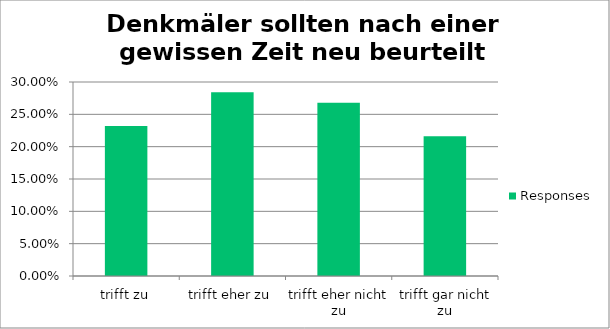
| Category | Responses |
|---|---|
| trifft zu | 0.232 |
| trifft eher zu | 0.284 |
| trifft eher nicht zu | 0.268 |
| trifft gar nicht zu | 0.216 |